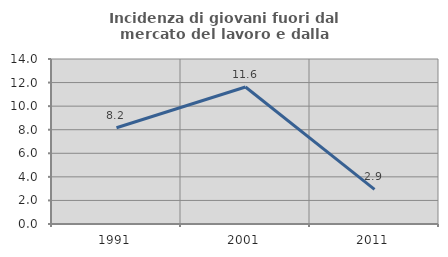
| Category | Incidenza di giovani fuori dal mercato del lavoro e dalla formazione  |
|---|---|
| 1991.0 | 8.163 |
| 2001.0 | 11.628 |
| 2011.0 | 2.941 |